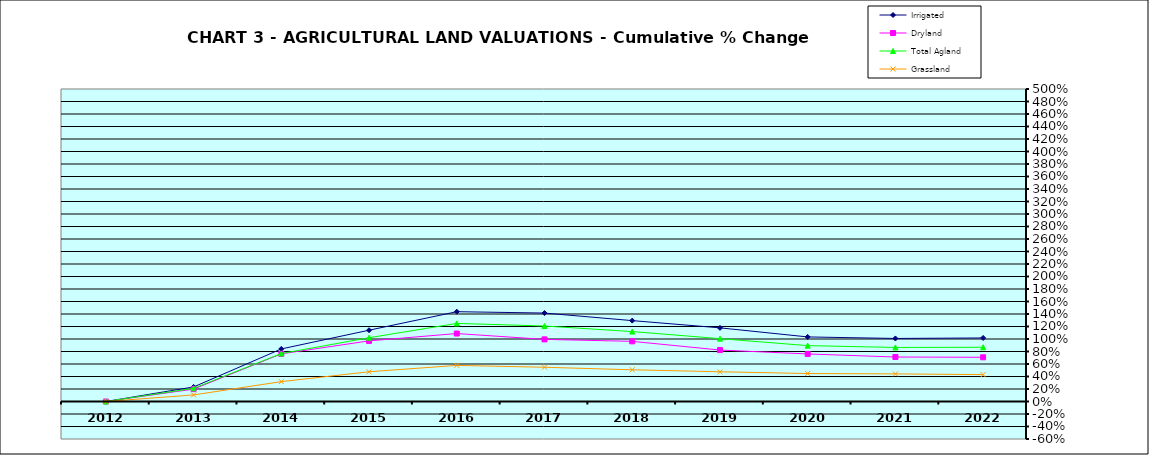
| Category | Irrigated | Dryland | Total Agland | Grassland |
|---|---|---|---|---|
| 2012.0 | 0 | 0 | 0 | 0 |
| 2013.0 | 0.233 | 0.198 | 0.21 | 0.105 |
| 2014.0 | 0.841 | 0.763 | 0.768 | 0.318 |
| 2015.0 | 1.141 | 0.97 | 1.021 | 0.476 |
| 2016.0 | 1.437 | 1.087 | 1.249 | 0.578 |
| 2017.0 | 1.415 | 0.994 | 1.208 | 0.548 |
| 2018.0 | 1.294 | 0.963 | 1.119 | 0.507 |
| 2019.0 | 1.178 | 0.823 | 1.006 | 0.476 |
| 2020.0 | 1.033 | 0.761 | 0.894 | 0.448 |
| 2021.0 | 1.009 | 0.712 | 0.865 | 0.442 |
| 2022.0 | 1.017 | 0.707 | 0.868 | 0.43 |